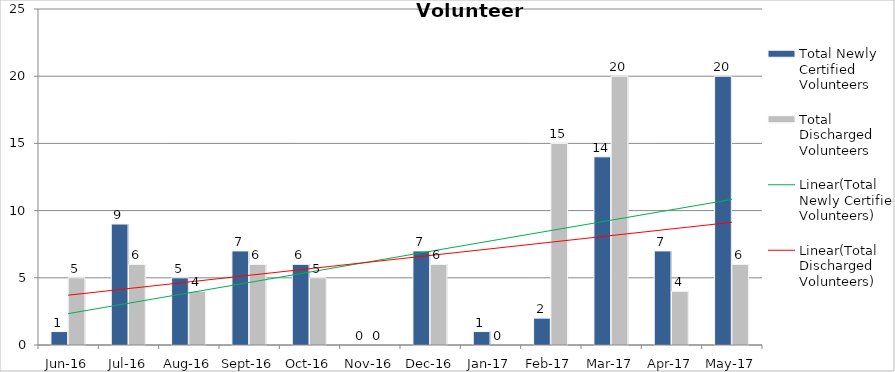
| Category | Total Newly Certified Volunteers | Total Discharged Volunteers |
|---|---|---|
| Jun-16 | 1 | 5 |
| Jul-16 | 9 | 6 |
| Aug-16 | 5 | 4 |
| Sep-16 | 7 | 6 |
| Oct-16 | 6 | 5 |
| Nov-16 | 0 | 0 |
| Dec-16 | 7 | 6 |
| Jan-17 | 1 | 0 |
| Feb-17 | 2 | 15 |
| Mar-17 | 14 | 20 |
| Apr-17 | 7 | 4 |
| May-17 | 20 | 6 |